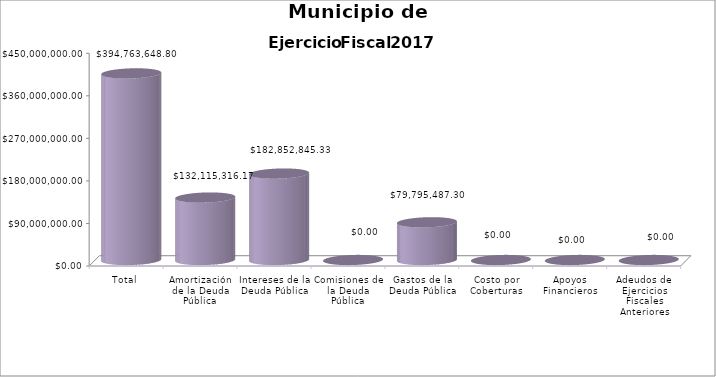
| Category | Municipio de Guadalajara
Deuda Pública 2017  Importe |
|---|---|
| Total | 394763648.8 |
| Amortización de la Deuda Pública | 132115316.17 |
| Intereses de la Deuda Pública | 182852845.33 |
| Comisiones de la Deuda Pública | 0 |
| Gastos de la Deuda Pública | 79795487.3 |
| Costo por Coberturas | 0 |
| Apoyos Financieros | 0 |
| Adeudos de Ejercicios Fiscales Anteriores (ADEFAS) | 0 |